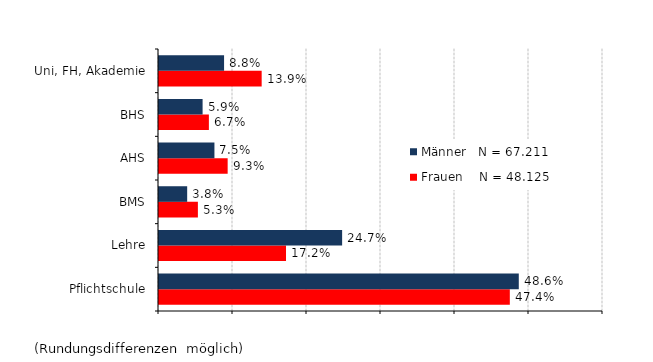
| Category | Frauen    N = 48.125 | Männer   N = 67.211 |
|---|---|---|
| Pflichtschule | 0.474 | 0.486 |
| Lehre | 0.172 | 0.247 |
| BMS | 0.053 | 0.038 |
| AHS | 0.093 | 0.075 |
| BHS | 0.067 | 0.059 |
| Uni, FH, Akademie | 0.139 | 0.088 |